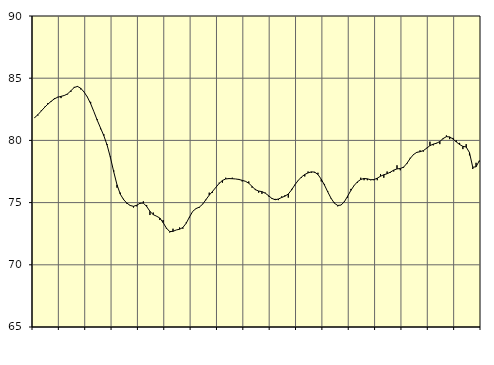
| Category | Piggar | Series 1 |
|---|---|---|
| nan | 81.8 | 81.83 |
| 87.0 | 82 | 82.07 |
| 87.0 | 82.4 | 82.36 |
| 87.0 | 82.7 | 82.65 |
| nan | 83 | 82.91 |
| 88.0 | 83.1 | 83.14 |
| 88.0 | 83.4 | 83.34 |
| 88.0 | 83.5 | 83.47 |
| nan | 83.4 | 83.54 |
| 89.0 | 83.6 | 83.61 |
| 89.0 | 83.7 | 83.74 |
| 89.0 | 83.9 | 83.99 |
| nan | 84.3 | 84.25 |
| 90.0 | 84.3 | 84.34 |
| 90.0 | 84.1 | 84.19 |
| 90.0 | 83.9 | 83.89 |
| nan | 83.5 | 83.49 |
| 91.0 | 83.1 | 82.95 |
| 91.0 | 82.3 | 82.3 |
| 91.0 | 81.7 | 81.62 |
| nan | 80.9 | 81 |
| 92.0 | 80.5 | 80.38 |
| 92.0 | 79.7 | 79.62 |
| 92.0 | 78.7 | 78.63 |
| nan | 77.6 | 77.48 |
| 93.0 | 76.2 | 76.43 |
| 93.0 | 75.8 | 75.68 |
| 93.0 | 75.3 | 75.24 |
| nan | 74.9 | 74.96 |
| 94.0 | 74.8 | 74.77 |
| 94.0 | 74.6 | 74.7 |
| 94.0 | 74.7 | 74.79 |
| nan | 74.9 | 74.95 |
| 95.0 | 75.1 | 74.96 |
| 95.0 | 74.8 | 74.69 |
| 95.0 | 74 | 74.3 |
| nan | 74.2 | 74.03 |
| 96.0 | 73.9 | 73.91 |
| 96.0 | 73.6 | 73.76 |
| 96.0 | 73.6 | 73.39 |
| nan | 72.9 | 72.95 |
| 97.0 | 72.6 | 72.67 |
| 97.0 | 72.9 | 72.69 |
| 97.0 | 72.8 | 72.8 |
| nan | 73 | 72.86 |
| 98.0 | 72.9 | 73 |
| 98.0 | 73.4 | 73.34 |
| 98.0 | 73.8 | 73.84 |
| nan | 74.3 | 74.3 |
| 99.0 | 74.5 | 74.52 |
| 99.0 | 74.6 | 74.64 |
| 99.0 | 74.9 | 74.87 |
| nan | 75.2 | 75.24 |
| 0.0 | 75.8 | 75.6 |
| 0.0 | 75.8 | 75.9 |
| 0.0 | 76.2 | 76.22 |
| nan | 76.6 | 76.54 |
| 1.0 | 76.6 | 76.78 |
| 1.0 | 77 | 76.9 |
| 1.0 | 76.9 | 76.93 |
| nan | 77 | 76.92 |
| 2.0 | 76.9 | 76.9 |
| 2.0 | 76.9 | 76.86 |
| 2.0 | 76.7 | 76.79 |
| nan | 76.7 | 76.71 |
| 3.0 | 76.7 | 76.56 |
| 3.0 | 76.2 | 76.3 |
| 3.0 | 76.1 | 76.04 |
| nan | 75.8 | 75.93 |
| 4.0 | 75.7 | 75.88 |
| 4.0 | 75.8 | 75.76 |
| 4.0 | 75.5 | 75.56 |
| nan | 75.3 | 75.34 |
| 5.0 | 75.3 | 75.23 |
| 5.0 | 75.2 | 75.29 |
| 5.0 | 75.5 | 75.41 |
| nan | 75.6 | 75.52 |
| 6.0 | 75.4 | 75.69 |
| 6.0 | 76.1 | 76.02 |
| 6.0 | 76.4 | 76.43 |
| nan | 76.8 | 76.78 |
| 7.0 | 77 | 77.06 |
| 7.0 | 77.1 | 77.26 |
| 7.0 | 77.5 | 77.39 |
| nan | 77.4 | 77.47 |
| 8.0 | 77.4 | 77.45 |
| 8.0 | 77.4 | 77.26 |
| 8.0 | 76.7 | 76.88 |
| nan | 76.5 | 76.4 |
| 9.0 | 75.9 | 75.85 |
| 9.0 | 75.3 | 75.34 |
| 9.0 | 75 | 74.95 |
| nan | 74.7 | 74.77 |
| 10.0 | 74.8 | 74.8 |
| 10.0 | 75.1 | 75.06 |
| 10.0 | 75.4 | 75.51 |
| nan | 76.1 | 75.98 |
| 11.0 | 76.4 | 76.38 |
| 11.0 | 76.6 | 76.67 |
| 11.0 | 77 | 76.86 |
| nan | 76.8 | 76.94 |
| 12.0 | 76.8 | 76.91 |
| 12.0 | 76.8 | 76.84 |
| 12.0 | 76.8 | 76.85 |
| nan | 76.8 | 76.96 |
| 13.0 | 77.3 | 77.12 |
| 13.0 | 77 | 77.24 |
| 13.0 | 77.5 | 77.32 |
| nan | 77.4 | 77.45 |
| 14.0 | 77.5 | 77.61 |
| 14.0 | 78 | 77.71 |
| 14.0 | 77.6 | 77.74 |
| nan | 77.8 | 77.85 |
| 15.0 | 78.1 | 78.15 |
| 15.0 | 78.6 | 78.55 |
| 15.0 | 78.9 | 78.86 |
| nan | 79 | 79.04 |
| 16.0 | 79.2 | 79.09 |
| 16.0 | 79.1 | 79.18 |
| 16.0 | 79.4 | 79.37 |
| nan | 79.9 | 79.58 |
| 17.0 | 79.6 | 79.7 |
| 17.0 | 79.8 | 79.77 |
| 17.0 | 79.7 | 79.91 |
| nan | 80.1 | 80.15 |
| 18.0 | 80.4 | 80.3 |
| 18.0 | 80.1 | 80.28 |
| 18.0 | 80.2 | 80.11 |
| nan | 80 | 79.88 |
| 19.0 | 79.8 | 79.67 |
| 19.0 | 79.3 | 79.52 |
| 19.0 | 79.7 | 79.47 |
| nan | 78.8 | 79.02 |
| 20.0 | 77.7 | 77.84 |
| 20.0 | 78.2 | 77.88 |
| 20.0 | 78.3 | 78.37 |